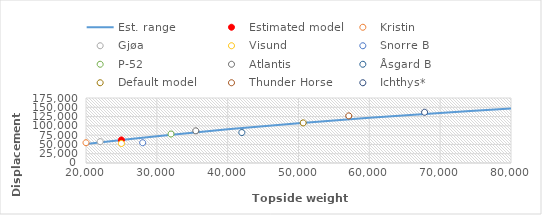
| Category | Est. range |
|---|---|
| 20000.0 | 51348 |
| 30000.0 | 72201 |
| 40000.0 | 90597 |
| 50000.0 | 106946 |
| 60000.0 | 121572 |
| 70000.0 | 134734 |
| 80000.0 | 146641 |